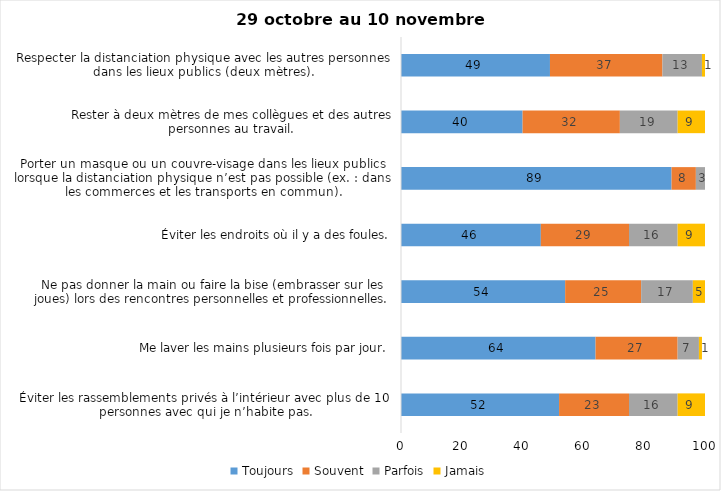
| Category | Toujours | Souvent | Parfois | Jamais |
|---|---|---|---|---|
| Éviter les rassemblements privés à l’intérieur avec plus de 10 personnes avec qui je n’habite pas. | 52 | 23 | 16 | 9 |
| Me laver les mains plusieurs fois par jour. | 64 | 27 | 7 | 1 |
| Ne pas donner la main ou faire la bise (embrasser sur les joues) lors des rencontres personnelles et professionnelles. | 54 | 25 | 17 | 5 |
| Éviter les endroits où il y a des foules. | 46 | 29 | 16 | 9 |
| Porter un masque ou un couvre-visage dans les lieux publics lorsque la distanciation physique n’est pas possible (ex. : dans les commerces et les transports en commun). | 89 | 8 | 3 | 0 |
| Rester à deux mètres de mes collègues et des autres personnes au travail. | 40 | 32 | 19 | 9 |
| Respecter la distanciation physique avec les autres personnes dans les lieux publics (deux mètres). | 49 | 37 | 13 | 1 |